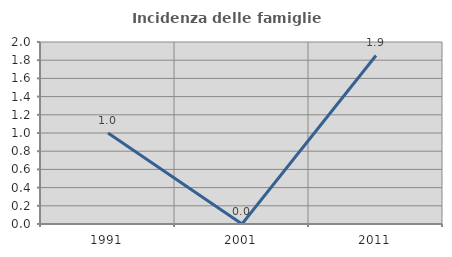
| Category | Incidenza delle famiglie numerose |
|---|---|
| 1991.0 | 1 |
| 2001.0 | 0 |
| 2011.0 | 1.852 |